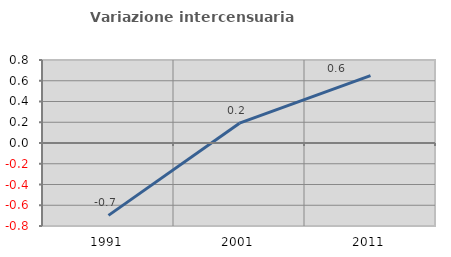
| Category | Variazione intercensuaria annua |
|---|---|
| 1991.0 | -0.698 |
| 2001.0 | 0.191 |
| 2011.0 | 0.649 |